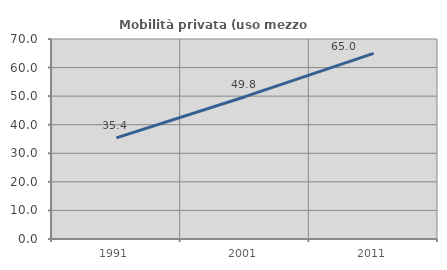
| Category | Mobilità privata (uso mezzo privato) |
|---|---|
| 1991.0 | 35.393 |
| 2001.0 | 49.804 |
| 2011.0 | 64.989 |